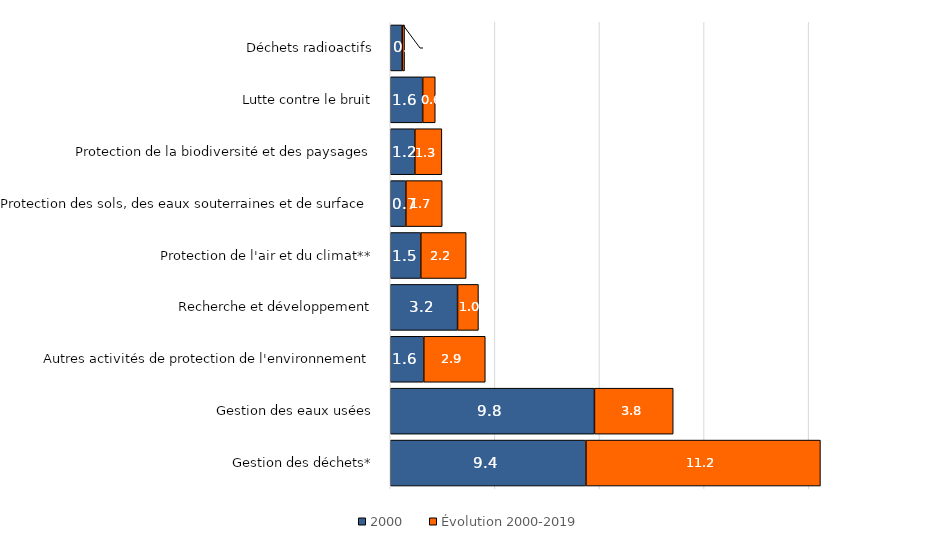
| Category | 2000 | Évolution 2000-2019 |
|---|---|---|
| Gestion des déchets* | 9.354 | 11.208 |
| Gestion des eaux usées | 9.761 | 3.765 |
| Autres activités de protection de l'environnement | 1.603 | 2.94 |
| Recherche et développement | 3.217 | 0.999 |
| Protection de l'air et du climat** | 1.46 | 2.169 |
| Protection des sols, des eaux souterraines et de surface | 0.745 | 1.739 |
| Protection de la biodiversité et des paysages | 1.175 | 1.293 |
| Lutte contre le bruit | 1.55 | 0.601 |
| Déchets radioactifs | 0.57 | 0.113 |